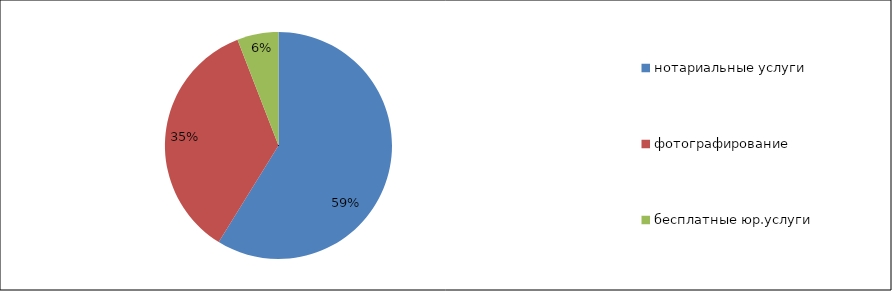
| Category | Series 0 | Series 1 |
|---|---|---|
| нотариальные услуги | 10 | 32 |
| фотографирование | 6 | 32 |
| бесплатные юр.услуги | 1 | 32 |